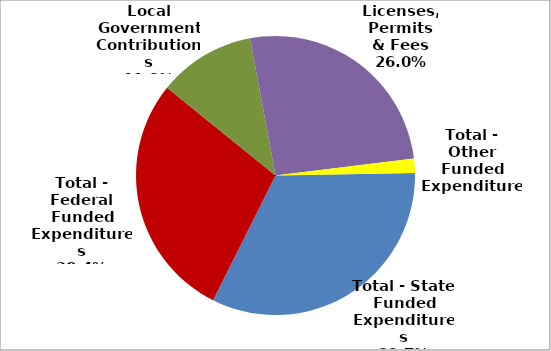
| Category | Series 0 |
|---|---|
| Total - State Funded Expenditures | 7966669 |
| Total - Federal Funded Expenditures | 6936851 |
| Local Government Contributions | 2745896 |
| Licenses, Permits & Fees | 6336271 |
| Total - Other Funded Expenditures | 406081 |